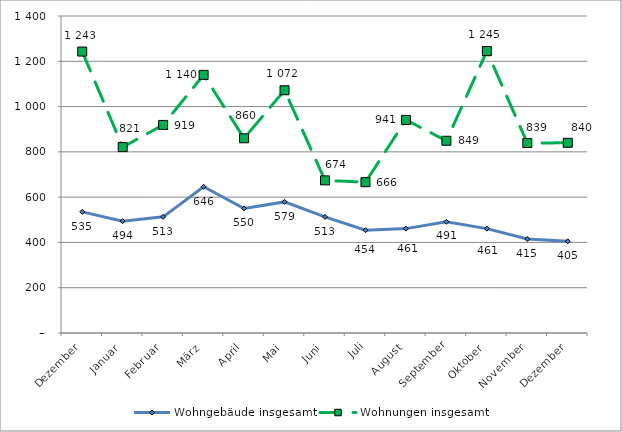
| Category | Wohngebäude insgesamt | Wohnungen insgesamt |
|---|---|---|
| Dezember | 535 | 1243 |
| Januar | 494 | 821 |
| Februar | 513 | 919 |
| März | 646 | 1140 |
| April | 550 | 860 |
| Mai | 579 | 1072 |
| Juni | 513 | 674 |
| Juli | 454 | 666 |
| August | 461 | 941 |
| September | 491 | 849 |
| Oktober | 461 | 1245 |
| November | 415 | 839 |
| Dezember | 405 | 840 |